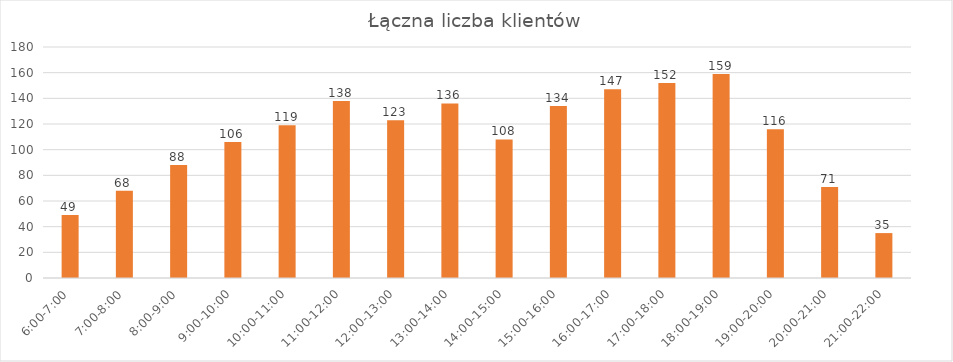
| Category | Wchodzący |
|---|---|
| 6:00-7:00 | 49 |
| 7:00-8:00 | 68 |
| 8:00-9:00 | 88 |
| 9:00-10:00 | 106 |
| 10:00-11:00 | 119 |
| 11:00-12:00 | 138 |
| 12:00-13:00 | 123 |
| 13:00-14:00 | 136 |
| 14:00-15:00 | 108 |
| 15:00-16:00 | 134 |
| 16:00-17:00 | 147 |
| 17:00-18:00 | 152 |
| 18:00-19:00 | 159 |
| 19:00-20:00 | 116 |
| 20:00-21:00 | 71 |
| 21:00-22:00 | 35 |